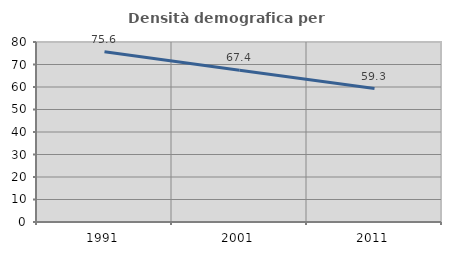
| Category | Densità demografica |
|---|---|
| 1991.0 | 75.643 |
| 2001.0 | 67.444 |
| 2011.0 | 59.32 |